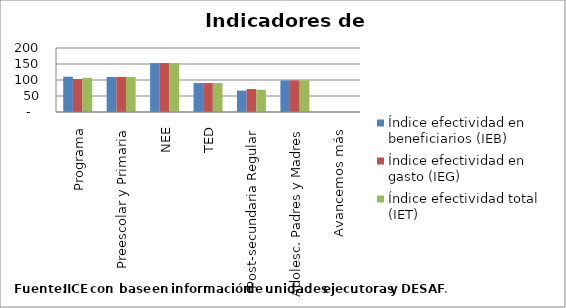
| Category | Índice efectividad en beneficiarios (IEB) | Índice efectividad en gasto (IEG)  | Índice efectividad total (IET) |
|---|---|---|---|
| Programa | 110.234 | 103.121 | 106.678 |
| Preescolar y Primaria | 109.648 | 109.648 | 109.648 |
| NEE | 152.715 | 152.715 | 152.715 |
| TED | 90.482 | 90.482 | 90.482 |
| Post-secundaria Regular | 66.893 | 71.76 | 69.327 |
| Adolesc. Padres y Madres | 98.679 | 98.679 | 98.679 |
| Avancemos más | 0 | 0 | 0 |